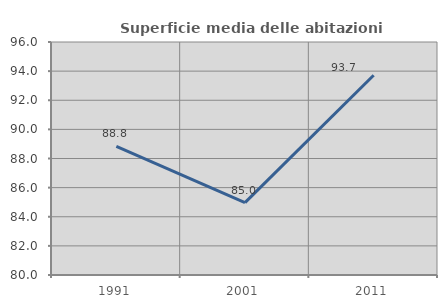
| Category | Superficie media delle abitazioni occupate |
|---|---|
| 1991.0 | 88.841 |
| 2001.0 | 84.974 |
| 2011.0 | 93.718 |